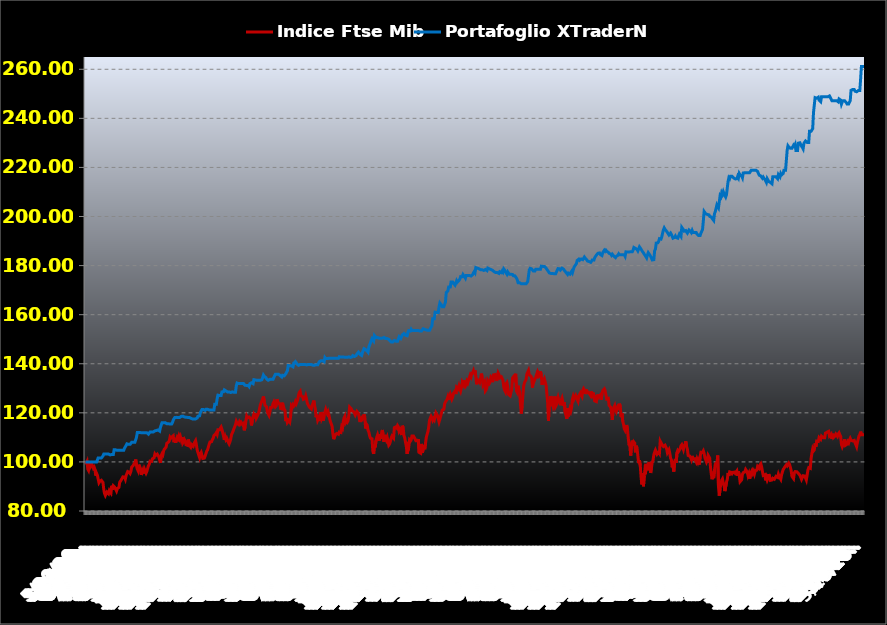
| Category | Indice Ftse Mib | Portafoglio XTraderNet |
|---|---|---|
| 5/20/13 | 100 | 100 |
| 5/21/13 | 99.546 | 99.944 |
| 5/22/13 | 100.22 | 99.944 |
| 5/23/13 | 97.153 | 99.944 |
| 5/24/13 | 96.515 | 99.944 |
| 5/27/13 | 98.014 | 99.944 |
| 5/28/13 | 100.074 | 99.944 |
| 5/29/13 | 98.459 | 99.944 |
| 5/30/13 | 99.109 | 99.944 |
| 5/31/13 | 98.328 | 99.944 |
| 6/3/13 | 97.436 | 99.944 |
| 6/4/13 | 97.879 | 99.944 |
| 6/5/13 | 96.94 | 99.944 |
| 6/6/13 | 94.392 | 99.944 |
| 6/7/13 | 95.34 | 99.944 |
| 6/10/13 | 94.571 | 99.944 |
| 6/11/13 | 93.03 | 101.633 |
| 6/12/13 | 91.53 | 101.633 |
| 6/13/13 | 92.057 | 101.633 |
| 6/14/13 | 92.266 | 101.633 |
| 6/17/13 | 92.502 | 101.633 |
| 6/18/13 | 92.523 | 101.633 |
| 6/19/13 | 91.653 | 102.387 |
| 6/20/13 | 88.818 | 103.193 |
| 6/21/13 | 87.136 | 103.193 |
| 6/24/13 | 86.323 | 103.193 |
| 6/25/13 | 86.004 | 103.193 |
| 6/26/13 | 87.753 | 103.193 |
| 6/27/13 | 88.14 | 103.193 |
| 6/28/13 | 87.047 | 103.193 |
| 7/1/13 | 88.306 | 103.193 |
| 7/2/13 | 87.77 | 102.861 |
| 7/3/13 | 87.296 | 102.679 |
| 7/4/13 | 90.297 | 103.039 |
| 7/5/13 | 88.729 | 103.039 |
| 7/8/13 | 90.248 | 103.039 |
| 7/9/13 | 90.196 | 104.91 |
| 7/10/13 | 89.549 | 104.91 |
| 7/11/13 | 89.549 | 104.91 |
| 7/12/13 | 88.14 | 104.715 |
| 7/15/13 | 89.093 | 104.715 |
| 7/16/13 | 88.708 | 104.715 |
| 7/17/13 | 89.651 | 104.715 |
| 7/18/13 | 91.699 | 104.715 |
| 7/19/13 | 92.103 | 104.715 |
| 7/22/13 | 92.727 | 104.715 |
| 7/23/13 | 92.755 | 104.715 |
| 7/24/13 | 93.921 | 104.715 |
| 7/25/13 | 93.86 | 104.715 |
| 7/26/13 | 93.8 | 105.597 |
| 7/29/13 | 92.968 | 105.946 |
| 7/30/13 | 94.494 | 106.742 |
| 7/31/13 | 94.148 | 107.372 |
| 8/1/13 | 96.071 | 107.153 |
| 8/2/13 | 95.843 | 107.153 |
| 8/5/13 | 95.718 | 107.153 |
| 8/6/13 | 95.295 | 107.153 |
| 8/7/13 | 96.18 | 107.153 |
| 8/8/13 | 97.942 | 108.015 |
| 8/9/13 | 98.17 | 108.015 |
| 8/12/13 | 98.606 | 108.015 |
| 8/13/13 | 99.276 | 108.015 |
| 8/14/13 | 99.752 | 108.015 |
| 8/16/13 | 100.976 | 108.015 |
| 8/19/13 | 98.494 | 110.05 |
| 8/20/13 | 97.102 | 111.94 |
| 8/21/13 | 96.407 | 111.94 |
| 8/22/13 | 98.875 | 111.94 |
| 8/23/13 | 99.06 | 111.94 |
| 8/26/13 | 96.978 | 111.94 |
| 8/27/13 | 94.705 | 111.94 |
| 8/28/13 | 95.637 | 111.85 |
| 8/29/13 | 96.563 | 111.85 |
| 8/30/13 | 95.29 | 111.85 |
| 9/2/13 | 97.039 | 111.85 |
| 9/3/13 | 96.768 | 111.85 |
| 9/4/13 | 95.461 | 111.85 |
| 9/5/13 | 96.206 | 111.85 |
| 9/6/13 | 97.373 | 111.85 |
| 9/9/13 | 98.503 | 111.319 |
| 9/10/13 | 99.004 | 111.319 |
| 9/11/13 | 100.318 | 112.225 |
| 9/12/13 | 100.09 | 112.225 |
| 9/13/13 | 100.234 | 112.225 |
| 9/16/13 | 101.285 | 112.225 |
| 9/17/13 | 101.398 | 112.225 |
| 9/18/13 | 101.701 | 112.225 |
| 9/19/13 | 103.155 | 112.635 |
| 9/20/13 | 102.646 | 112.635 |
| 9/23/13 | 102.321 | 112.818 |
| 9/24/13 | 103.186 | 112.496 |
| 9/25/13 | 103.327 | 113.024 |
| 9/26/13 | 102.089 | 112.879 |
| 9/27/13 | 100.796 | 112.577 |
| 9/30/13 | 99.589 | 114.165 |
| 10/1/13 | 102.686 | 114.245 |
| 10/2/13 | 103.379 | 115.99 |
| 10/3/13 | 102.921 | 115.99 |
| 10/4/13 | 104.554 | 115.99 |
| 10/7/13 | 105.249 | 115.99 |
| 10/8/13 | 104.946 | 115.99 |
| 10/9/13 | 105.967 | 115.808 |
| 10/10/13 | 107.597 | 115.565 |
| 10/11/13 | 107.858 | 115.565 |
| 10/14/13 | 108.059 | 115.565 |
| 10/15/13 | 108.524 | 115.565 |
| 10/16/13 | 110.1 | 115.418 |
| 10/17/13 | 109.66 | 115.418 |
| 10/18/13 | 110.077 | 115.418 |
| 10/21/13 | 110.029 | 116.011 |
| 10/22/13 | 110.653 | 117.022 |
| 10/23/13 | 108.019 | 117.64 |
| 10/24/13 | 109.402 | 118.083 |
| 10/25/13 | 107.813 | 118.443 |
| 10/28/13 | 107.554 | 118.156 |
| 10/29/13 | 109.996 | 117.839 |
| 10/30/13 | 109.482 | 118.108 |
| 10/31/13 | 110.537 | 118.108 |
| 11/1/13 | 109.467 | 118.108 |
| 11/4/13 | 110.303 | 118.108 |
| 11/5/13 | 109.054 | 118.557 |
| 11/6/13 | 110.028 | 118.59 |
| 11/7/13 | 107.749 | 118.661 |
| 11/8/13 | 108.31 | 118.324 |
| 11/11/13 | 109.145 | 118.324 |
| 11/12/13 | 108.557 | 118.324 |
| 11/13/13 | 107.004 | 118.219 |
| 11/14/13 | 107.162 | 118.144 |
| 11/15/13 | 106.742 | 118.144 |
| 11/18/13 | 109.131 | 118.144 |
| 11/19/13 | 107.197 | 118.144 |
| 11/20/13 | 106.46 | 118.144 |
| 11/21/13 | 105.995 | 117.808 |
| 11/22/13 | 107.039 | 117.563 |
| 11/25/13 | 106.818 | 117.523 |
| 11/26/13 | 106.38 | 117.523 |
| 11/27/13 | 107.371 | 117.523 |
| 11/28/13 | 108.064 | 117.523 |
| 11/29/13 | 108.652 | 117.523 |
| 12/2/13 | 107.001 | 117.606 |
| 12/3/13 | 104.912 | 117.908 |
| 12/4/13 | 103.791 | 118.623 |
| 12/5/13 | 102.777 | 119.008 |
| 12/6/13 | 101.796 | 118.789 |
| 12/9/13 | 103.28 | 120.022 |
| 12/10/13 | 103.873 | 120.743 |
| 12/11/13 | 102.613 | 121.326 |
| 12/12/13 | 101.42 | 121.326 |
| 12/13/13 | 101.631 | 121.326 |
| 12/16/13 | 101.568 | 121.326 |
| 12/17/13 | 102.39 | 121.015 |
| 12/18/13 | 102.674 | 121.433 |
| 12/19/13 | 104.434 | 121.433 |
| 12/20/13 | 104.877 | 121.433 |
| 12/23/13 | 106.026 | 121.433 |
| 12/27/13 | 107.184 | 121.189 |
| 12/30/13 | 108.102 | 121.189 |
| 1/2/14 | 107.935 | 121.189 |
| 1/3/14 | 108.252 | 121.189 |
| 1/6/14 | 109.078 | 121.189 |
| 1/7/14 | 109.617 | 121.189 |
| 1/8/14 | 110.728 | 121.189 |
| 1/9/14 | 110.507 | 123.493 |
| 1/10/14 | 111.402 | 123.493 |
| 1/13/14 | 111.922 | 123.493 |
| 1/14/14 | 111.244 | 125.69 |
| 1/15/14 | 113.078 | 127.208 |
| 1/16/14 | 113.347 | 126.969 |
| 1/17/14 | 113.077 | 127.093 |
| 1/20/14 | 113.675 | 127.385 |
| 1/21/14 | 114.217 | 127.085 |
| 1/22/14 | 113.267 | 128.536 |
| 1/23/14 | 112.927 | 128.149 |
| 1/24/14 | 110.579 | 128.563 |
| 1/27/14 | 109.03 | 129.359 |
| 1/28/14 | 110.265 | 129.359 |
| 1/29/14 | 109.145 | 128.941 |
| 1/30/14 | 109.708 | 128.805 |
| 1/31/14 | 108.937 | 128.518 |
| 2/3/14 | 107.999 | 128.518 |
| 2/4/14 | 107.353 | 128.518 |
| 2/5/14 | 108.191 | 128.518 |
| 2/6/14 | 109.253 | 128.286 |
| 2/7/14 | 111.068 | 128.286 |
| 2/10/14 | 111.809 | 128.552 |
| 2/11/14 | 112.557 | 128.382 |
| 2/12/14 | 113.499 | 128.382 |
| 2/13/14 | 113.198 | 128.382 |
| 2/14/14 | 115.16 | 128.382 |
| 2/17/14 | 116.521 | 131.034 |
| 2/18/14 | 115.833 | 132.146 |
| 2/19/14 | 115.817 | 131.963 |
| 2/20/14 | 115.219 | 131.925 |
| 2/21/14 | 116.262 | 131.925 |
| 2/24/14 | 115.603 | 131.925 |
| 2/25/14 | 116.16 | 131.925 |
| 2/26/14 | 116.272 | 131.925 |
| 2/27/14 | 115.146 | 131.925 |
| 2/28/14 | 115.568 | 131.925 |
| 3/3/14 | 112.868 | 131.632 |
| 3/4/14 | 114.189 | 131.241 |
| 3/5/14 | 116.568 | 131.156 |
| 3/6/14 | 118.596 | 131.156 |
| 3/7/14 | 117.864 | 131.156 |
| 3/10/14 | 117.513 | 131.156 |
| 3/11/14 | 118.293 | 130.74 |
| 3/12/14 | 118.024 | 131.864 |
| 3/13/14 | 117.621 | 132.258 |
| 3/14/14 | 114.879 | 132.258 |
| 3/17/14 | 116.617 | 132.258 |
| 3/18/14 | 118.395 | 131.892 |
| 3/19/14 | 119.471 | 133.502 |
| 3/20/14 | 118.868 | 133.502 |
| 3/21/14 | 119.793 | 133.401 |
| 3/24/14 | 117.82 | 133.25 |
| 3/25/14 | 118.042 | 133.25 |
| 3/26/14 | 119.14 | 133.25 |
| 3/27/14 | 120.017 | 133.25 |
| 3/28/14 | 121.415 | 133.25 |
| 3/31/14 | 123.091 | 133.25 |
| 4/1/14 | 124.015 | 133.25 |
| 4/2/14 | 123.75 | 133.478 |
| 4/3/14 | 125.619 | 134.288 |
| 4/4/14 | 126.665 | 135.374 |
| 4/7/14 | 124.76 | 134.876 |
| 4/8/14 | 123.064 | 134.51 |
| 4/9/14 | 123.44 | 134.374 |
| 4/10/14 | 122.404 | 133.806 |
| 4/11/14 | 120.313 | 133.676 |
| 4/14/14 | 119.565 | 133.286 |
| 4/15/14 | 118.91 | 133.286 |
| 4/16/14 | 120.232 | 133.637 |
| 4/17/14 | 122.186 | 133.637 |
| 4/18/14 | 122.186 | 133.637 |
| 4/21/14 | 122.26 | 133.637 |
| 4/22/14 | 123.735 | 133.637 |
| 4/23/14 | 124.438 | 134.418 |
| 4/24/14 | 124.634 | 135.118 |
| 4/25/14 | 122.475 | 135.72 |
| 4/28/14 | 122.888 | 135.72 |
| 4/29/14 | 125.533 | 135.72 |
| 4/30/14 | 124.428 | 135.72 |
| 5/2/14 | 124.42 | 135.72 |
| 5/5/14 | 123.608 | 135.625 |
| 5/6/14 | 122.933 | 135.137 |
| 5/7/14 | 121.328 | 134.785 |
| 5/8/14 | 124.121 | 134.601 |
| 5/9/14 | 122.181 | 135.296 |
| 5/12/14 | 122.773 | 135.134 |
| 5/13/14 | 121.415 | 135.1 |
| 5/14/14 | 121.007 | 134.846 |
| 5/15/14 | 116.638 | 135.942 |
| 5/16/14 | 117.946 | 135.688 |
| 5/19/14 | 116.06 | 137.139 |
| 5/20/14 | 116.411 | 139.284 |
| 5/21/14 | 116.948 | 139.161 |
| 5/22/14 | 116.37 | 139.161 |
| 5/23/14 | 118.502 | 139.161 |
| 5/26/14 | 122.774 | 139.161 |
| 5/27/14 | 122.258 | 139.006 |
| 5/28/14 | 123.3 | 138.776 |
| 5/29/14 | 122.874 | 140.269 |
| 5/30/14 | 123.55 | 139.97 |
| 6/2/14 | 124.501 | 140.892 |
| 6/3/14 | 123.704 | 140.421 |
| 6/4/14 | 123.51 | 139.891 |
| 6/5/14 | 125.385 | 139.724 |
| 6/6/14 | 127.322 | 139.381 |
| 6/9/14 | 128.362 | 139.158 |
| 6/10/14 | 128.791 | 139.719 |
| 6/11/14 | 126.943 | 139.719 |
| 6/12/14 | 126.599 | 139.719 |
| 6/13/14 | 126.613 | 139.719 |
| 6/16/14 | 125.529 | 139.719 |
| 6/17/14 | 125.644 | 139.719 |
| 6/18/14 | 125.838 | 139.719 |
| 6/19/14 | 126.902 | 139.719 |
| 6/20/14 | 125.597 | 139.542 |
| 6/23/14 | 123.921 | 139.542 |
| 6/24/14 | 123.616 | 139.702 |
| 6/25/14 | 122.632 | 139.665 |
| 6/26/14 | 122.149 | 139.665 |
| 6/27/14 | 121.779 | 139.665 |
| 6/30/14 | 121.57 | 139.665 |
| 7/1/14 | 123.171 | 139.665 |
| 7/2/14 | 123.829 | 139.423 |
| 7/3/14 | 125.006 | 139.423 |
| 7/4/14 | 123.147 | 139.423 |
| 7/7/14 | 121.514 | 139.608 |
| 7/8/14 | 118.242 | 139.608 |
| 7/9/14 | 119.298 | 139.596 |
| 7/10/14 | 117.033 | 139.596 |
| 7/11/14 | 117.753 | 139.596 |
| 7/14/14 | 118.225 | 140.802 |
| 7/15/14 | 116.657 | 140.439 |
| 7/16/14 | 120.353 | 141.256 |
| 7/17/14 | 117.687 | 141.256 |
| 7/18/14 | 118.451 | 141.256 |
| 7/21/14 | 116.704 | 141.205 |
| 7/22/14 | 119.23 | 140.83 |
| 7/23/14 | 118.989 | 142.538 |
| 7/24/14 | 121.413 | 142.125 |
| 7/25/14 | 120.315 | 142.125 |
| 7/28/14 | 119.605 | 142.125 |
| 7/29/14 | 120.439 | 142.234 |
| 7/30/14 | 119.31 | 142.234 |
| 7/31/14 | 117.501 | 142.234 |
| 8/1/14 | 116.311 | 142.234 |
| 8/4/14 | 116.419 | 142.234 |
| 8/5/14 | 114.539 | 142.234 |
| 8/6/14 | 111.441 | 142.234 |
| 8/7/14 | 109.275 | 142.234 |
| 8/8/14 | 109.634 | 142.234 |
| 8/11/14 | 111.16 | 142.234 |
| 8/12/14 | 110.907 | 142.234 |
| 8/13/14 | 111.598 | 142.234 |
| 8/14/14 | 111.276 | 142.234 |
| 8/15/14 | 111.276 | 142.234 |
| 8/18/14 | 112.184 | 142.868 |
| 8/19/14 | 112.209 | 142.713 |
| 8/20/14 | 111.99 | 142.713 |
| 8/21/14 | 114.301 | 142.713 |
| 8/22/14 | 113.772 | 142.713 |
| 8/25/14 | 116.385 | 142.713 |
| 8/26/14 | 117.928 | 142.713 |
| 8/27/14 | 118.6 | 142.612 |
| 8/28/14 | 116.189 | 142.612 |
| 8/29/14 | 116.814 | 142.612 |
| 9/1/14 | 116.216 | 142.612 |
| 9/2/14 | 116.79 | 142.612 |
| 9/3/14 | 118.993 | 142.825 |
| 9/4/14 | 122.348 | 142.745 |
| 9/5/14 | 122.21 | 142.582 |
| 9/8/14 | 121.634 | 142.739 |
| 9/9/14 | 120.809 | 142.823 |
| 9/10/14 | 120.756 | 143.331 |
| 9/11/14 | 120.48 | 143.117 |
| 9/12/14 | 120.359 | 142.981 |
| 9/15/14 | 119.106 | 142.974 |
| 9/16/14 | 118.745 | 143.319 |
| 9/17/14 | 120.591 | 143.922 |
| 9/18/14 | 120.688 | 144.253 |
| 9/19/14 | 119.795 | 144.723 |
| 9/22/14 | 118.085 | 144.298 |
| 9/23/14 | 116.246 | 143.832 |
| 9/24/14 | 118.188 | 143.616 |
| 9/25/14 | 116.591 | 143.385 |
| 9/26/14 | 118.784 | 144.593 |
| 9/29/14 | 117.246 | 144.323 |
| 9/30/14 | 119.337 | 146.157 |
| 10/1/14 | 118.275 | 145.924 |
| 10/2/14 | 113.64 | 145.762 |
| 10/3/14 | 115.387 | 145.501 |
| 10/6/14 | 114.925 | 145.166 |
| 10/7/14 | 112.937 | 144.748 |
| 10/8/14 | 112.216 | 146.77 |
| 10/9/14 | 110.714 | 146.85 |
| 10/10/14 | 109.677 | 148.531 |
| 10/13/14 | 109.323 | 149.457 |
| 10/14/14 | 109.419 | 150.195 |
| 10/15/14 | 104.559 | 149.719 |
| 10/16/14 | 103.292 | 149.289 |
| 10/17/14 | 106.821 | 151.509 |
| 10/20/14 | 105.902 | 151.325 |
| 10/21/14 | 108.859 | 150.696 |
| 10/22/14 | 110.05 | 150.696 |
| 10/23/14 | 111.013 | 150.696 |
| 10/24/14 | 111.36 | 150.696 |
| 10/27/14 | 108.693 | 150.422 |
| 10/28/14 | 111.251 | 150.422 |
| 10/29/14 | 109.428 | 150.422 |
| 10/30/14 | 109.64 | 150.422 |
| 10/31/14 | 113.007 | 150.422 |
| 11/3/14 | 110.637 | 150.422 |
| 11/4/14 | 108.155 | 150.745 |
| 11/5/14 | 110.973 | 150.72 |
| 11/6/14 | 110.161 | 150.242 |
| 11/7/14 | 109.073 | 150.242 |
| 11/10/14 | 110.006 | 150.242 |
| 11/11/14 | 109.988 | 150.242 |
| 11/12/14 | 106.828 | 149.978 |
| 11/13/14 | 107.287 | 149.529 |
| 11/14/14 | 108.331 | 149.125 |
| 11/17/14 | 109.767 | 148.885 |
| 11/18/14 | 110.545 | 148.885 |
| 11/19/14 | 110.699 | 148.885 |
| 11/20/14 | 109.724 | 148.885 |
| 11/21/14 | 113.981 | 149.483 |
| 11/24/14 | 113.817 | 149.249 |
| 11/25/14 | 114.297 | 149.205 |
| 11/26/14 | 113.889 | 149.205 |
| 11/27/14 | 114.815 | 149.205 |
| 11/28/14 | 114.326 | 149.205 |
| 12/1/14 | 112.45 | 150.985 |
| 12/2/14 | 112.988 | 150.656 |
| 12/3/14 | 114.117 | 150.305 |
| 12/4/14 | 110.953 | 151.029 |
| 12/5/14 | 114.739 | 151.746 |
| 12/8/14 | 113.962 | 151.719 |
| 12/9/14 | 110.757 | 152.329 |
| 12/10/14 | 109.772 | 151.988 |
| 12/11/14 | 109.677 | 151.622 |
| 12/12/14 | 106.249 | 151.608 |
| 12/15/14 | 103.268 | 151.406 |
| 12/16/14 | 106.644 | 152.838 |
| 12/17/14 | 106.067 | 153.509 |
| 12/18/14 | 108.877 | 153.423 |
| 12/19/14 | 108.436 | 153.362 |
| 12/22/14 | 108.952 | 154.056 |
| 12/23/14 | 110.54 | 153.547 |
| 12/24/14 | 110.54 | 153.547 |
| 12/25/14 | 110.54 | 153.547 |
| 12/26/14 | 110.54 | 153.547 |
| 12/29/14 | 109.272 | 153.547 |
| 12/30/14 | 108.597 | 153.547 |
| 12/31/14 | 108.597 | 153.547 |
| 1/1/15 | 108.597 | 153.547 |
| 1/2/15 | 109.273 | 153.547 |
| 1/5/15 | 103.893 | 153.547 |
| 1/6/15 | 103.635 | 153.341 |
| 1/7/15 | 103.522 | 153.341 |
| 1/8/15 | 107.34 | 153.341 |
| 1/9/15 | 103.828 | 153.341 |
| 1/12/15 | 104.811 | 154.263 |
| 1/13/15 | 106.866 | 154.065 |
| 1/14/15 | 105.163 | 153.997 |
| 1/15/15 | 107.641 | 153.874 |
| 1/16/15 | 109.983 | 153.78 |
| 1/19/15 | 111.274 | 153.78 |
| 1/20/15 | 112.291 | 153.617 |
| 1/21/15 | 114.135 | 153.617 |
| 1/22/15 | 116.924 | 153.617 |
| 1/23/15 | 117.21 | 153.231 |
| 1/26/15 | 118.563 | 154.929 |
| 1/27/15 | 117.93 | 155.468 |
| 1/28/15 | 116.974 | 158.325 |
| 1/29/15 | 117.632 | 158.325 |
| 1/30/15 | 117.116 | 158.325 |
| 2/2/15 | 117.015 | 161.022 |
| 2/3/15 | 120.019 | 160.908 |
| 2/4/15 | 119.62 | 160.908 |
| 2/5/15 | 118.919 | 160.908 |
| 2/6/15 | 118.586 | 160.908 |
| 2/9/15 | 116.335 | 163.243 |
| 2/10/15 | 117.422 | 164.765 |
| 2/11/15 | 117.474 | 164.765 |
| 2/12/15 | 119.97 | 163.905 |
| 2/13/15 | 121.118 | 163.278 |
| 2/16/15 | 120.901 | 163.278 |
| 2/17/15 | 121.472 | 163.278 |
| 2/18/15 | 123.717 | 163.278 |
| 2/19/15 | 124.465 | 165.111 |
| 2/20/15 | 124.768 | 169.015 |
| 2/23/15 | 125.459 | 168.783 |
| 2/24/15 | 126.522 | 169.631 |
| 2/25/15 | 125.305 | 171.241 |
| 2/26/15 | 126.607 | 171.241 |
| 2/27/15 | 127.596 | 171.241 |
| 3/2/15 | 127.367 | 173.32 |
| 3/3/15 | 125.591 | 173.24 |
| 3/4/15 | 126.413 | 173.336 |
| 3/5/15 | 127.95 | 172.785 |
| 3/6/15 | 128.155 | 172.393 |
| 3/9/15 | 128.887 | 172.017 |
| 3/10/15 | 127.641 | 171.644 |
| 3/11/15 | 130.423 | 173.855 |
| 3/12/15 | 130.286 | 173.27 |
| 3/13/15 | 129.743 | 172.941 |
| 3/16/15 | 130.983 | 173.984 |
| 3/17/15 | 129.795 | 174.505 |
| 3/18/15 | 128.892 | 175.504 |
| 3/19/15 | 130.263 | 175.479 |
| 3/20/15 | 132.388 | 175.479 |
| 3/23/15 | 131.703 | 176.382 |
| 3/24/15 | 133.279 | 175.925 |
| 3/25/15 | 132.205 | 175.52 |
| 3/26/15 | 130.806 | 174.836 |
| 3/27/15 | 131.286 | 175.964 |
| 3/30/15 | 132.868 | 175.964 |
| 3/31/15 | 132.274 | 175.964 |
| 4/1/15 | 133.428 | 175.964 |
| 4/2/15 | 133.139 | 175.964 |
| 4/7/15 | 135.412 | 176.017 |
| 4/8/15 | 134.683 | 175.744 |
| 4/9/15 | 135.969 | 175.744 |
| 4/10/15 | 136.388 | 176.272 |
| 4/13/15 | 137.14 | 177.033 |
| 4/14/15 | 135.678 | 177.551 |
| 4/15/15 | 137.263 | 177.059 |
| 4/16/15 | 134.866 | 179.183 |
| 4/17/15 | 131.629 | 179.139 |
| 4/20/15 | 133.279 | 178.954 |
| 4/21/15 | 132.749 | 178.715 |
| 4/22/15 | 133.179 | 178.715 |
| 4/23/15 | 132.516 | 178.715 |
| 4/24/15 | 133.818 | 178.308 |
| 4/27/15 | 135.982 | 178.308 |
| 4/28/15 | 134.416 | 178.308 |
| 4/29/15 | 131.352 | 178.024 |
| 4/30/15 | 131.637 | 178.024 |
| 5/4/15 | 132.617 | 177.691 |
| 5/5/15 | 128.957 | 178.417 |
| 5/6/15 | 129.434 | 178.469 |
| 5/7/15 | 130.474 | 177.964 |
| 5/8/15 | 133.162 | 178.98 |
| 5/11/15 | 133.215 | 178.671 |
| 5/12/15 | 131.976 | 178.671 |
| 5/13/15 | 132.582 | 178.51 |
| 5/14/15 | 134.511 | 178.378 |
| 5/15/15 | 134.081 | 178.378 |
| 5/18/15 | 132.509 | 178.062 |
| 5/19/15 | 135.451 | 177.742 |
| 5/20/15 | 135.79 | 177.496 |
| 5/21/15 | 135.602 | 177.496 |
| 5/22/15 | 135.843 | 177.142 |
| 5/25/15 | 133.006 | 177.142 |
| 5/26/15 | 133.245 | 177.142 |
| 5/27/15 | 136.295 | 176.813 |
| 5/28/15 | 135.627 | 176.813 |
| 5/29/15 | 134.208 | 177.506 |
| 6/1/15 | 133.866 | 177.506 |
| 6/2/15 | 134.668 | 177.148 |
| 6/3/15 | 134.855 | 177.799 |
| 6/4/15 | 133.299 | 177.365 |
| 6/5/15 | 130.505 | 178.643 |
| 6/8/15 | 129.334 | 178.227 |
| 6/9/15 | 128.678 | 177.493 |
| 6/10/15 | 131.9 | 177.012 |
| 6/11/15 | 132.361 | 176.487 |
| 6/12/15 | 130.679 | 177.44 |
| 6/15/15 | 127.539 | 176.959 |
| 6/16/15 | 127.855 | 176.453 |
| 6/17/15 | 126.951 | 176.453 |
| 6/18/15 | 128.293 | 176.453 |
| 6/19/15 | 129.66 | 176.427 |
| 6/22/15 | 134.153 | 176.381 |
| 6/23/15 | 134.617 | 175.862 |
| 6/24/15 | 133.908 | 175.544 |
| 6/25/15 | 135.048 | 175.816 |
| 6/26/15 | 135.949 | 175.329 |
| 6/29/15 | 128.921 | 174.883 |
| 6/30/15 | 128.297 | 174.141 |
| 7/1/15 | 131.055 | 173 |
| 7/2/15 | 129.186 | 173 |
| 7/3/15 | 128.567 | 173 |
| 7/6/15 | 123.384 | 173 |
| 7/7/15 | 119.716 | 172.57 |
| 7/8/15 | 122.88 | 172.57 |
| 7/9/15 | 127.199 | 172.57 |
| 7/10/15 | 131.019 | 172.57 |
| 7/13/15 | 132.331 | 172.57 |
| 7/14/15 | 131.934 | 172.57 |
| 7/15/15 | 133.62 | 172.57 |
| 7/16/15 | 135.85 | 172.57 |
| 7/17/15 | 135.749 | 173.452 |
| 7/20/15 | 137.267 | 175.75 |
| 7/21/15 | 135.449 | 178.242 |
| 7/22/15 | 135.268 | 178.879 |
| 7/23/15 | 134.993 | 178.616 |
| 7/24/15 | 134.277 | 178.656 |
| 7/27/15 | 130.288 | 178.305 |
| 7/28/15 | 133.251 | 177.79 |
| 7/29/15 | 132.799 | 177.79 |
| 7/30/15 | 133.639 | 177.79 |
| 7/31/15 | 134.45 | 178.475 |
| 8/3/15 | 135.458 | 178.475 |
| 8/4/15 | 134.08 | 178.475 |
| 8/5/15 | 136.585 | 178.475 |
| 8/6/15 | 136.01 | 178.475 |
| 8/7/15 | 135.404 | 178.475 |
| 8/10/15 | 136.897 | 178.475 |
| 8/11/15 | 135.367 | 179.752 |
| 8/12/15 | 131.363 | 179.677 |
| 8/13/15 | 133.411 | 179.677 |
| 8/14/15 | 132.797 | 179.677 |
| 8/17/15 | 133.707 | 179.677 |
| 8/18/15 | 133.603 | 179.677 |
| 8/19/15 | 131.236 | 179.017 |
| 8/20/15 | 127.828 | 178.476 |
| 8/21/15 | 124.215 | 178.039 |
| 8/24/15 | 116.814 | 177.645 |
| 8/25/15 | 123.664 | 177.044 |
| 8/26/15 | 122.659 | 176.811 |
| 8/27/15 | 126.814 | 176.811 |
| 8/28/15 | 125.629 | 176.811 |
| 8/31/15 | 125.333 | 176.811 |
| 9/1/15 | 122.531 | 176.811 |
| 9/2/15 | 123.449 | 176.656 |
| 9/3/15 | 126.678 | 176.656 |
| 9/4/15 | 122.653 | 176.656 |
| 9/7/15 | 123.328 | 176.656 |
| 9/8/15 | 125.33 | 178.116 |
| 9/9/15 | 126.388 | 178.769 |
| 9/10/15 | 125.102 | 178.742 |
| 9/11/15 | 124.309 | 178.698 |
| 9/14/15 | 123.116 | 178.202 |
| 9/15/15 | 125.114 | 178.358 |
| 9/16/15 | 126.003 | 178.959 |
| 9/17/15 | 126.233 | 178.9 |
| 9/18/15 | 122.894 | 178.515 |
| 9/21/15 | 124.268 | 178.009 |
| 9/22/15 | 120.135 | 177.72 |
| 9/23/15 | 120.346 | 177.183 |
| 9/24/15 | 117.564 | 176.837 |
| 9/25/15 | 121.89 | 176.377 |
| 9/28/15 | 118.579 | 176.928 |
| 9/29/15 | 118.392 | 176.928 |
| 9/30/15 | 121.638 | 176.508 |
| 10/1/15 | 120.769 | 176.131 |
| 10/2/15 | 122.211 | 177.638 |
| 10/5/15 | 125.551 | 177.041 |
| 10/6/15 | 126.708 | 177.041 |
| 10/7/15 | 125.707 | 179.315 |
| 10/8/15 | 126.56 | 179.839 |
| 10/9/15 | 127.138 | 179.839 |
| 10/12/15 | 126.186 | 180.769 |
| 10/13/15 | 125.942 | 182.108 |
| 10/14/15 | 124.741 | 182.108 |
| 10/15/15 | 126.908 | 182.626 |
| 10/16/15 | 127.178 | 182.156 |
| 10/19/15 | 128.062 | 181.783 |
| 10/20/15 | 127.208 | 182.702 |
| 10/21/15 | 126.651 | 182.673 |
| 10/22/15 | 129.189 | 182.414 |
| 10/23/15 | 129.874 | 182.414 |
| 10/26/15 | 129.261 | 183.509 |
| 10/27/15 | 127.778 | 183.071 |
| 10/28/15 | 129.585 | 182.757 |
| 10/29/15 | 128.194 | 182.318 |
| 10/30/15 | 128.193 | 181.833 |
| 11/2/15 | 128.42 | 181.833 |
| 11/3/15 | 128.289 | 181.624 |
| 11/4/15 | 127.451 | 181.28 |
| 11/5/15 | 126.943 | 181.335 |
| 11/6/15 | 128.692 | 181.292 |
| 11/9/15 | 126.278 | 182.312 |
| 11/10/15 | 128.201 | 182.274 |
| 11/11/15 | 127.865 | 182.251 |
| 11/12/15 | 124.861 | 183.248 |
| 11/13/15 | 124.766 | 183.772 |
| 11/16/15 | 124.587 | 184.263 |
| 11/17/15 | 127.432 | 184.359 |
| 11/18/15 | 126.188 | 185.028 |
| 11/19/15 | 126.762 | 185.176 |
| 11/20/15 | 126.465 | 185.155 |
| 11/23/15 | 127.348 | 184.52 |
| 11/24/15 | 125.369 | 184.113 |
| 11/25/15 | 127.717 | 184.095 |
| 11/26/15 | 129.044 | 185.281 |
| 11/27/15 | 128.95 | 185.041 |
| 11/30/15 | 129.766 | 186.275 |
| 12/1/15 | 128.986 | 185.827 |
| 12/2/15 | 128.817 | 186.265 |
| 12/3/15 | 125.64 | 185.82 |
| 12/4/15 | 125.787 | 185.901 |
| 12/7/15 | 125.877 | 185.39 |
| 12/8/15 | 123.026 | 184.966 |
| 12/9/15 | 122.814 | 184.63 |
| 12/10/15 | 122.293 | 184.707 |
| 12/11/15 | 120.04 | 184.176 |
| 12/14/15 | 117.134 | 184.642 |
| 12/15/15 | 121.51 | 184.32 |
| 12/16/15 | 121.154 | 183.819 |
| 12/17/15 | 122.941 | 183.63 |
| 12/18/15 | 121.335 | 183.263 |
| 12/21/15 | 120.52 | 183.778 |
| 12/22/15 | 120.296 | 183.447 |
| 12/23/15 | 122.492 | 184.182 |
| 12/28/15 | 122.062 | 184.8 |
| 12/29/15 | 123.73 | 184.388 |
| 12/30/15 | 122.343 | 184.388 |
| 1/4/16 | 118.432 | 184.379 |
| 1/5/16 | 119.857 | 184.379 |
| 1/6/16 | 116.654 | 184.379 |
| 1/7/16 | 115.323 | 184.379 |
| 1/8/16 | 113.495 | 184.379 |
| 1/11/16 | 112.848 | 183.775 |
| 1/12/16 | 114.07 | 185.596 |
| 1/13/16 | 115.04 | 185.563 |
| 1/14/16 | 113.118 | 185.563 |
| 1/15/16 | 109.648 | 185.563 |
| 1/18/16 | 106.74 | 185.563 |
| 1/19/16 | 107.846 | 185.294 |
| 1/20/16 | 102.633 | 185.627 |
| 1/21/16 | 106.948 | 185.627 |
| 1/22/16 | 108.691 | 185.627 |
| 1/25/16 | 106.481 | 186.286 |
| 1/26/16 | 108.094 | 187.388 |
| 1/27/16 | 107.661 | 186.997 |
| 1/28/16 | 103.902 | 187.017 |
| 1/29/16 | 106.571 | 186.999 |
| 2/1/16 | 105.593 | 186.553 |
| 2/2/16 | 102.374 | 185.992 |
| 2/3/16 | 99.458 | 186.297 |
| 2/4/16 | 100.681 | 187.653 |
| 2/5/16 | 98.534 | 187.206 |
| 2/8/16 | 93.913 | 186.693 |
| 2/9/16 | 90.896 | 186.091 |
| 2/10/16 | 95.472 | 185.699 |
| 2/11/16 | 90.096 | 185.18 |
| 2/12/16 | 94.334 | 184.612 |
| 2/15/16 | 97.344 | 184.176 |
| 2/16/16 | 96.643 | 183.661 |
| 2/17/16 | 99.263 | 183.117 |
| 2/18/16 | 97.747 | 184.337 |
| 2/19/16 | 96.588 | 185.259 |
| 2/22/16 | 99.987 | 184.871 |
| 2/23/16 | 98.038 | 184.324 |
| 2/24/16 | 95.502 | 183.724 |
| 2/25/16 | 97.702 | 183.078 |
| 2/26/16 | 99.868 | 182.295 |
| 2/29/16 | 100.664 | 182.616 |
| 3/1/16 | 102.885 | 182.405 |
| 3/2/16 | 103.996 | 186.01 |
| 3/3/16 | 104.807 | 186.742 |
| 3/4/16 | 104.41 | 189.181 |
| 3/7/16 | 103.155 | 189.134 |
| 3/8/16 | 102.917 | 189.29 |
| 3/9/16 | 104.01 | 189.794 |
| 3/10/16 | 103.492 | 190.965 |
| 3/11/16 | 108.459 | 190.921 |
| 3/14/16 | 108.425 | 190.794 |
| 3/15/16 | 107.189 | 191.827 |
| 3/16/16 | 106.997 | 193.22 |
| 3/17/16 | 106.29 | 194.574 |
| 3/18/16 | 106.309 | 195.373 |
| 3/21/16 | 106.798 | 194.792 |
| 3/22/16 | 106.808 | 194.705 |
| 3/23/16 | 105.461 | 193.972 |
| 3/24/16 | 103.764 | 193.506 |
| 3/29/16 | 103.798 | 192.942 |
| 3/30/16 | 104.961 | 192.461 |
| 3/31/16 | 103.484 | 192.306 |
| 4/1/16 | 101.542 | 193.261 |
| 4/4/16 | 100.756 | 192.694 |
| 4/5/16 | 97.729 | 191.886 |
| 4/6/16 | 98.481 | 191.161 |
| 4/7/16 | 96.067 | 190.926 |
| 4/8/16 | 99.987 | 191.485 |
| 4/11/16 | 101.233 | 192.045 |
| 4/12/16 | 99.645 | 191.433 |
| 4/13/16 | 103.763 | 191.093 |
| 4/14/16 | 104.697 | 191.164 |
| 4/15/16 | 104.287 | 191.57 |
| 4/18/16 | 104.863 | 192.825 |
| 4/19/16 | 105.376 | 192.49 |
| 4/20/16 | 106.577 | 191.875 |
| 4/21/16 | 107.003 | 195.576 |
| 4/22/16 | 106.741 | 195.623 |
| 4/25/16 | 105.12 | 194.649 |
| 4/26/16 | 106.646 | 194.032 |
| 4/27/16 | 107.104 | 193.921 |
| 4/28/16 | 108.396 | 194.273 |
| 4/29/16 | 106.247 | 193.658 |
| 5/2/16 | 105.217 | 193.228 |
| 5/3/16 | 102.627 | 193.568 |
| 5/4/16 | 102.449 | 194.489 |
| 5/5/16 | 102.382 | 194.433 |
| 5/6/16 | 101.919 | 193.854 |
| 5/9/16 | 101.022 | 193.431 |
| 5/10/16 | 102.444 | 194.306 |
| 5/11/16 | 101.092 | 193.506 |
| 5/12/16 | 100.825 | 193.506 |
| 5/13/16 | 101.271 | 193.506 |
| 5/16/16 | 101.315 | 193.506 |
| 5/17/16 | 99.954 | 193.506 |
| 5/18/16 | 101.181 | 192.851 |
| 5/19/16 | 100.221 | 192.851 |
| 5/20/16 | 101.745 | 192.276 |
| 5/23/16 | 98.962 | 192.276 |
| 5/24/16 | 102.268 | 192.276 |
| 5/25/16 | 103.967 | 193.253 |
| 5/26/16 | 104.056 | 193.253 |
| 5/27/16 | 103.88 | 194.714 |
| 5/30/16 | 104.481 | 198.209 |
| 5/31/16 | 103.365 | 202.047 |
| 6/1/16 | 101.736 | 201.67 |
| 6/2/16 | 101.488 | 201.114 |
| 6/3/16 | 99.933 | 201.235 |
| 6/6/16 | 100.675 | 200.844 |
| 6/7/16 | 102.677 | 201.211 |
| 6/8/16 | 102.301 | 200.694 |
| 6/9/16 | 101.468 | 200.045 |
| 6/10/16 | 97.791 | 199.795 |
| 6/13/16 | 94.945 | 199.785 |
| 6/14/16 | 92.943 | 199.214 |
| 6/15/16 | 94.329 | 198.928 |
| 6/16/16 | 93.403 | 198.376 |
| 6/17/16 | 96.667 | 201.187 |
| 6/20/16 | 99.124 | 202.001 |
| 6/21/16 | 99.568 | 201.725 |
| 6/22/16 | 98.951 | 204.76 |
| 6/23/16 | 102.624 | 204.175 |
| 6/24/16 | 89.815 | 203.58 |
| 6/27/16 | 86.272 | 203.328 |
| 6/28/16 | 89.117 | 208.478 |
| 6/29/16 | 91.09 | 208.011 |
| 6/30/16 | 92.522 | 209.699 |
| 7/1/16 | 93.082 | 209.058 |
| 7/4/16 | 91.463 | 210.121 |
| 7/5/16 | 90.137 | 209.267 |
| 7/6/16 | 88.101 | 208.537 |
| 7/7/16 | 88.172 | 207.899 |
| 7/8/16 | 91.772 | 208.869 |
| 7/11/16 | 92.881 | 208.857 |
| 7/12/16 | 95.511 | 214.305 |
| 7/13/16 | 94.408 | 215.83 |
| 7/14/16 | 95.948 | 215.411 |
| 7/15/16 | 95.665 | 216.364 |
| 7/18/16 | 95.749 | 216.364 |
| 7/19/16 | 95.241 | 216.364 |
| 7/20/16 | 95.756 | 216.364 |
| 7/21/16 | 95.993 | 215.703 |
| 7/22/16 | 95.84 | 215.327 |
| 7/25/16 | 95.346 | 215.327 |
| 7/26/16 | 95.374 | 215.327 |
| 7/27/16 | 96.322 | 215.347 |
| 7/28/16 | 94.378 | 216.361 |
| 7/29/16 | 96.23 | 215.742 |
| 8/1/16 | 94.562 | 217.525 |
| 8/2/16 | 91.955 | 216.947 |
| 8/3/16 | 92.134 | 217.004 |
| 8/4/16 | 92.743 | 216.478 |
| 8/5/16 | 94.97 | 215.777 |
| 8/8/16 | 95.641 | 217.747 |
| 8/9/16 | 95.94 | 217.855 |
| 8/10/16 | 95.914 | 217.855 |
| 8/11/16 | 96.932 | 217.855 |
| 8/12/16 | 97.092 | 217.855 |
| 8/16/16 | 95.922 | 217.855 |
| 8/17/16 | 94.411 | 217.855 |
| 8/18/16 | 95.24 | 217.855 |
| 8/19/16 | 93.164 | 217.855 |
| 8/22/16 | 93.501 | 217.855 |
| 8/23/16 | 95.837 | 218.859 |
| 8/24/16 | 96.486 | 218.859 |
| 8/25/16 | 95.453 | 218.859 |
| 8/26/16 | 96.214 | 218.859 |
| 8/29/16 | 95.135 | 218.859 |
| 8/30/16 | 96.485 | 218.859 |
| 8/31/16 | 96.781 | 218.859 |
| 9/1/16 | 96.667 | 218.859 |
| 9/2/16 | 98.155 | 218.348 |
| 9/5/16 | 98.193 | 217.508 |
| 9/6/16 | 97.405 | 216.841 |
| 9/7/16 | 98.777 | 216.558 |
| 9/8/16 | 99.251 | 216.536 |
| 9/9/16 | 97.999 | 216.166 |
| 9/12/16 | 96.192 | 215.613 |
| 9/13/16 | 94.521 | 216.093 |
| 9/14/16 | 94.477 | 215.557 |
| 9/15/16 | 94.794 | 215.126 |
| 9/16/16 | 92.49 | 214.516 |
| 9/19/16 | 93.673 | 213.881 |
| 9/20/16 | 92.576 | 215.42 |
| 9/21/16 | 93.391 | 215.234 |
| 9/22/16 | 95.035 | 214.25 |
| 9/23/16 | 93.979 | 214.212 |
| 9/26/16 | 92.492 | 213.876 |
| 9/27/16 | 92.162 | 213.918 |
| 9/28/16 | 92.662 | 213.332 |
| 9/29/16 | 93.328 | 216.203 |
| 9/30/16 | 93.683 | 216.203 |
| 10/3/16 | 92.958 | 216.203 |
| 10/4/16 | 93.152 | 216.203 |
| 10/5/16 | 94.115 | 216.166 |
| 10/6/16 | 94.201 | 215.762 |
| 10/7/16 | 93.708 | 215.405 |
| 10/10/16 | 95.005 | 217.079 |
| 10/11/16 | 94.101 | 216.826 |
| 10/12/16 | 94.079 | 216.135 |
| 10/13/16 | 92.931 | 217.513 |
| 10/14/16 | 94.771 | 216.951 |
| 10/17/16 | 94.993 | 216.576 |
| 10/18/16 | 96.914 | 217.533 |
| 10/19/16 | 97.358 | 218.874 |
| 10/20/16 | 97.912 | 218.874 |
| 10/21/16 | 98.057 | 218.874 |
| 10/24/16 | 98.851 | 218.874 |
| 10/25/16 | 98.419 | 226.972 |
| 10/26/16 | 98.708 | 228.813 |
| 10/27/16 | 99.541 | 228.367 |
| 10/28/16 | 98.957 | 228.367 |
| 10/31/16 | 97.819 | 227.819 |
| 11/1/16 | 96.524 | 227.821 |
| 11/2/16 | 94.103 | 227.821 |
| 11/3/16 | 93.791 | 227.821 |
| 11/4/16 | 93.213 | 229.062 |
| 11/7/16 | 95.601 | 228.603 |
| 11/8/16 | 96.062 | 229.321 |
| 11/9/16 | 95.961 | 226.937 |
| 11/10/16 | 95.99 | 226.937 |
| 11/11/16 | 96.033 | 226.937 |
| 11/14/16 | 95.313 | 229.894 |
| 11/15/16 | 95.29 | 229.894 |
| 11/16/16 | 94.591 | 230.046 |
| 11/17/16 | 94.565 | 229.315 |
| 11/18/16 | 92.912 | 228.656 |
| 11/21/16 | 93.091 | 228.155 |
| 11/22/16 | 94.362 | 227.55 |
| 11/23/16 | 94.433 | 229.837 |
| 11/24/16 | 94.253 | 229.837 |
| 11/25/16 | 94.335 | 230.774 |
| 11/28/16 | 92.632 | 230.774 |
| 11/29/16 | 94.602 | 230.2 |
| 11/30/16 | 96.707 | 230.2 |
| 12/1/16 | 97.666 | 230.2 |
| 12/2/16 | 97.601 | 234.74 |
| 12/5/16 | 97.392 | 234.74 |
| 12/6/16 | 101.433 | 234.74 |
| 12/7/16 | 103.563 | 234.74 |
| 12/8/16 | 105.261 | 235.806 |
| 12/9/16 | 104.488 | 242.398 |
| 12/12/16 | 104.932 | 242.398 |
| 12/13/16 | 107.544 | 248.445 |
| 12/14/16 | 106.28 | 248.214 |
| 12/15/16 | 108.499 | 248.214 |
| 12/16/16 | 108.613 | 248.501 |
| 12/19/16 | 108.351 | 248.633 |
| 12/20/16 | 109.941 | 247.392 |
| 12/21/16 | 109.76 | 247.013 |
| 12/22/16 | 109.221 | 246.781 |
| 12/23/16 | 110.5 | 248.768 |
| 12/27/16 | 110.761 | 248.768 |
| 12/28/16 | 109.896 | 248.768 |
| 12/29/16 | 109.694 | 248.768 |
| 12/30/16 | 109.869 | 248.768 |
| 1/2/17 | 111.765 | 248.768 |
| 1/3/17 | 111.805 | 248.768 |
| 1/4/17 | 112.108 | 248.768 |
| 1/5/17 | 112.201 | 248.768 |
| 1/6/17 | 112.457 | 248.768 |
| 1/9/17 | 110.585 | 249.141 |
| 1/10/17 | 110.952 | 249.141 |
| 1/11/17 | 111.31 | 247.885 |
| 1/12/17 | 109.423 | 247.216 |
| 1/13/17 | 111.468 | 247.216 |
| 1/16/17 | 109.941 | 247.216 |
| 1/17/17 | 110.221 | 247.216 |
| 1/18/17 | 110.574 | 247.216 |
| 1/19/17 | 111.333 | 247.216 |
| 1/20/17 | 111.268 | 247.216 |
| 1/23/17 | 110.405 | 247.216 |
| 1/24/17 | 111.382 | 246.717 |
| 1/25/17 | 111.855 | 247.913 |
| 1/26/17 | 111.04 | 247.913 |
| 1/27/17 | 110.41 | 247.447 |
| 1/30/17 | 107.155 | 245.792 |
| 1/31/17 | 106.191 | 246.664 |
| 2/1/17 | 107.047 | 247.167 |
| 2/2/17 | 107.896 | 247.167 |
| 2/3/17 | 109.192 | 247.167 |
| 2/6/17 | 106.779 | 247.093 |
| 2/7/17 | 106.602 | 246.463 |
| 2/8/17 | 107.225 | 245.84 |
| 2/9/17 | 108.229 | 245.84 |
| 2/10/17 | 107.741 | 245.84 |
| 2/13/17 | 108.898 | 245.84 |
| 2/14/17 | 109.601 | 247.199 |
| 2/15/17 | 108.85 | 251.406 |
| 2/16/17 | 109.029 | 251.215 |
| 2/17/17 | 108.566 | 251.781 |
| 2/20/17 | 108.407 | 251.781 |
| 2/21/17 | 108.778 | 251.748 |
| 2/22/17 | 107.871 | 251.051 |
| 2/23/17 | 107.498 | 251.051 |
| 2/24/17 | 106.225 | 250.835 |
| 2/27/17 | 108.039 | 250.835 |
| 2/28/17 | 108.033 | 251.311 |
| 3/1/17 | 110.61 | 251.311 |
| 3/2/17 | 111.046 | 251.311 |
| 3/3/17 | 112.324 | 255.971 |
| 3/6/17 | 111.098 | 261.11 |
| 3/7/17 | 111.098 | 261.11 |
| 3/8/17 | 111.098 | 261.11 |
| 3/9/17 | 111.098 | 261.11 |
| 3/10/17 | 111.098 | 261.11 |